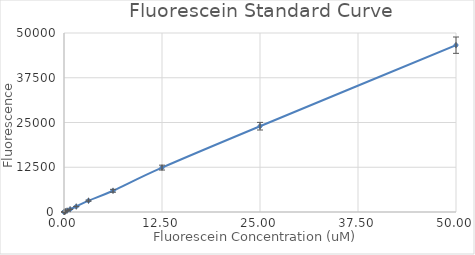
| Category | Series1 |
|---|---|
| 50.0 | 46597.5 |
| 25.0 | 23965.5 |
| 12.5 | 12403.25 |
| 6.25 | 5927.25 |
| 3.125 | 3161 |
| 1.5625 | 1531 |
| 0.78125 | 756.5 |
| 0.390625 | 384 |
| 0.195312 | 190.5 |
| 0.097656 | 95.75 |
| 0.048828 | 50 |
| 0.0 | 3.5 |